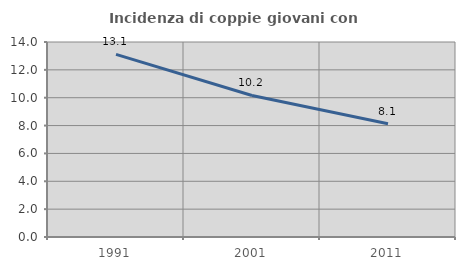
| Category | Incidenza di coppie giovani con figli |
|---|---|
| 1991.0 | 13.113 |
| 2001.0 | 10.161 |
| 2011.0 | 8.135 |